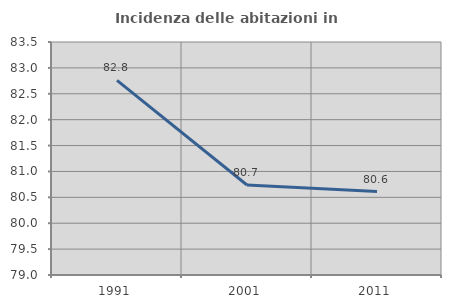
| Category | Incidenza delle abitazioni in proprietà  |
|---|---|
| 1991.0 | 82.759 |
| 2001.0 | 80.738 |
| 2011.0 | 80.612 |